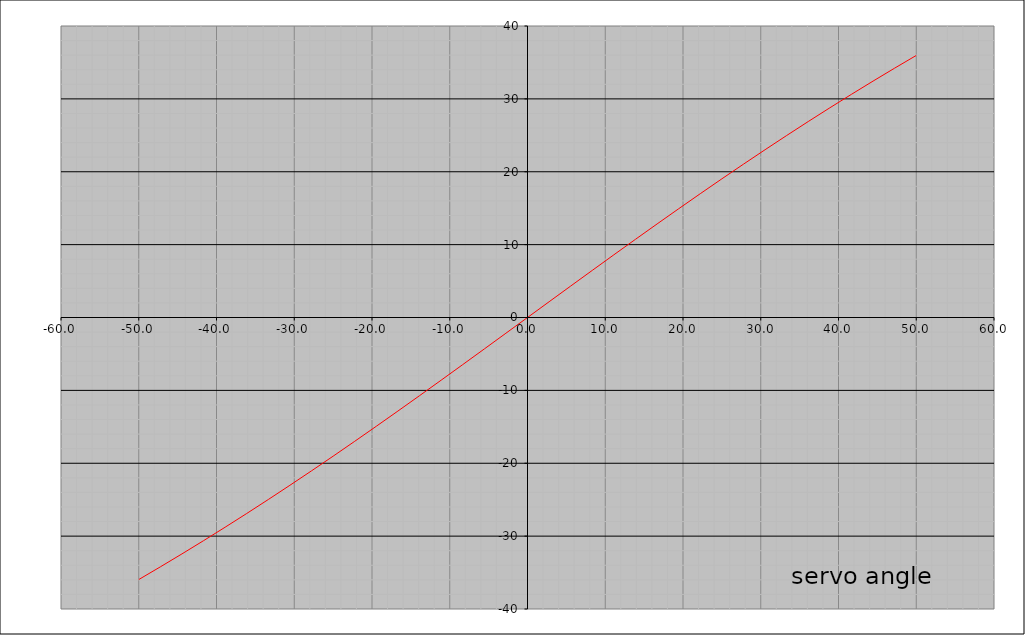
| Category | Series 0 |
|---|---|
| -50.0 | -35.959 |
| -47.22222222222222 | -34.217 |
| -44.44444444444444 | -32.439 |
| -41.666666666666664 | -30.626 |
| -38.888888888888886 | -28.776 |
| -36.11111111111111 | -26.892 |
| -33.33333333333333 | -24.974 |
| -30.55555555555555 | -23.023 |
| -27.77777777777777 | -21.041 |
| -24.999999999999993 | -19.029 |
| -22.222222222222214 | -16.99 |
| -19.444444444444436 | -14.925 |
| -16.666666666666657 | -12.837 |
| -13.888888888888879 | -10.73 |
| -11.1111111111111 | -8.605 |
| -8.333333333333321 | -6.466 |
| -5.555555555555544 | -4.317 |
| -2.777777777777766 | -2.16 |
| 1.1546319456101628e-14 | 0 |
| 2.7777777777777892 | 2.16 |
| 5.555555555555567 | 4.317 |
| 8.333333333333345 | 6.466 |
| 11.111111111111121 | 8.605 |
| 13.8888888888889 | 10.73 |
| 16.66666666666668 | 12.837 |
| 19.444444444444457 | 14.925 |
| 22.222222222222236 | 16.99 |
| 25.000000000000014 | 19.029 |
| 27.777777777777793 | 21.041 |
| 30.55555555555557 | 23.023 |
| 33.33333333333335 | 24.974 |
| 36.11111111111113 | 26.892 |
| 38.88888888888891 | 28.776 |
| 41.666666666666686 | 30.626 |
| 44.444444444444464 | 32.439 |
| 47.22222222222224 | 34.217 |
| 50.00000000000002 | 35.959 |